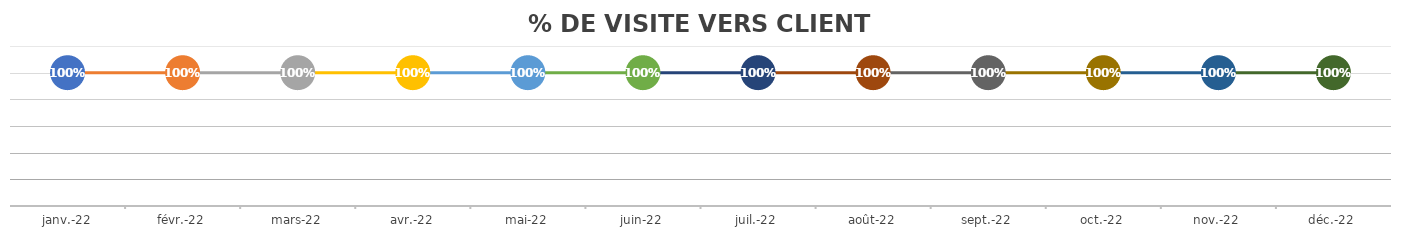
| Category | % DE VISITE VERS CLIENT POTENTIEL |
|---|---|
| 2022-01-18 | 1 |
| 2022-02-18 | 1 |
| 2022-03-18 | 1 |
| 2022-04-18 | 1 |
| 2022-05-18 | 1 |
| 2022-06-18 | 1 |
| 2022-07-18 | 1 |
| 2022-08-18 | 1 |
| 2022-09-18 | 1 |
| 2022-10-18 | 1 |
| 2022-11-18 | 1 |
| 2022-12-18 | 1 |